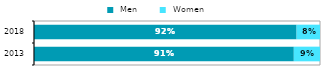
| Category |  Men |  Women |
|---|---|---|
| 2013.0 | 0.908 | 0.092 |
| 2018.0 | 0.918 | 0.082 |